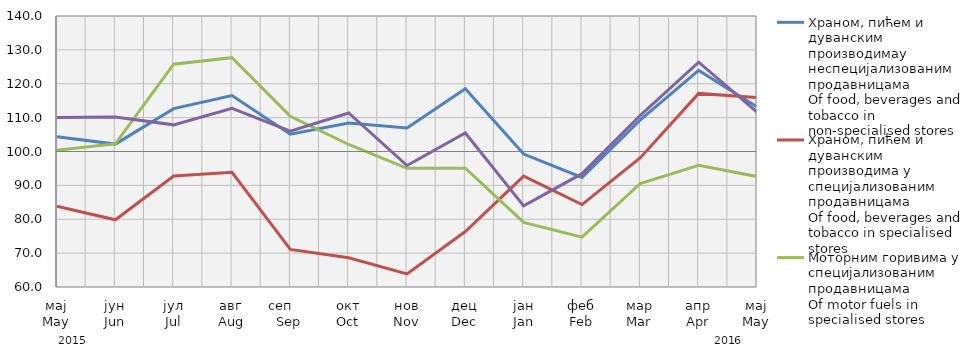
| Category | Храном, пићем и дуванским производимау неспецијализованим продавницама
Of food, beverages and tobacco in non-specialised stores
 | Храном, пићем и дуванским производима у специјализовaним продавницама
Оf food, beverages and tobacco in specialised stores | Моторним горивима у специјализованим продавницама
Of motor fuels in specialised stores | Остала
Other |
|---|---|---|---|---|
| мај
May | 104.379 | 83.858 | 100.375 | 110.009 |
| јун
Jun | 102.183 | 79.832 | 102.276 | 110.183 |
| јул
Jul | 112.664 | 92.74 | 125.76 | 107.864 |
| авг
Aug | 116.519 | 93.864 | 127.707 | 112.769 |
| сеп     Sep | 105.123 | 71.088 | 110.411 | 106.02 |
| окт
Oct | 108.393 | 68.621 | 102.068 | 111.365 |
| нов
Nov | 106.938 | 63.847 | 95.032 | 95.869 |
| дец
Dec | 118.498 | 76.368 | 95.084 | 105.475 |
| јан
Jan | 99.255 | 92.722 | 79.068 | 83.94 |
| феб
Feb | 92.363 | 84.339 | 74.7 | 93.451 |
| мар
Mar | 109.349 | 98.183 | 90.564 | 110.695 |
| апр
Apr | 123.935 | 117.147 | 95.897 | 126.373 |
| мај
May | 113.15 | 115.884 | 92.592 | 111.621 |